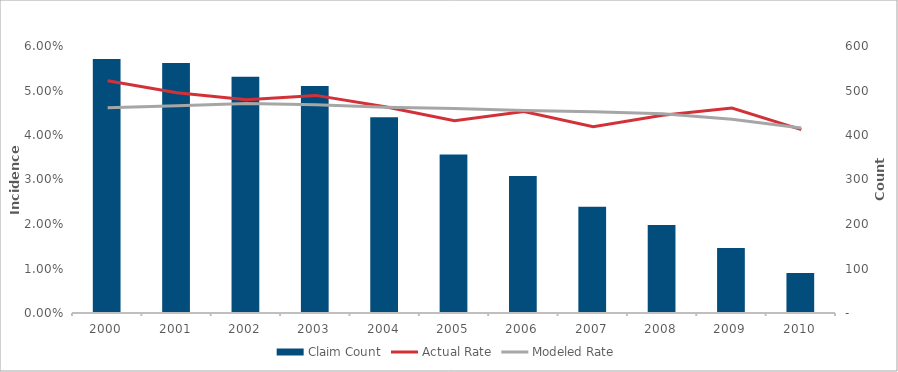
| Category | Claim Count |
|---|---|
| 2000.0 | 571 |
| 2001.0 | 562 |
| 2002.0 | 531 |
| 2003.0 | 510 |
| 2004.0 | 440 |
| 2005.0 | 356 |
| 2006.0 | 308 |
| 2007.0 | 239 |
| 2008.0 | 198 |
| 2009.0 | 146 |
| 2010.0 | 90 |